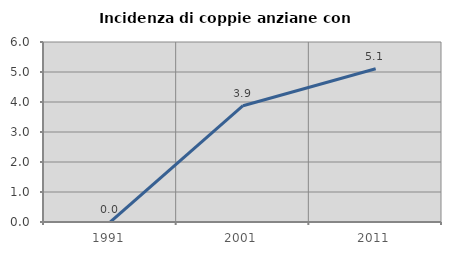
| Category | Incidenza di coppie anziane con figli |
|---|---|
| 1991.0 | 0 |
| 2001.0 | 3.876 |
| 2011.0 | 5.109 |